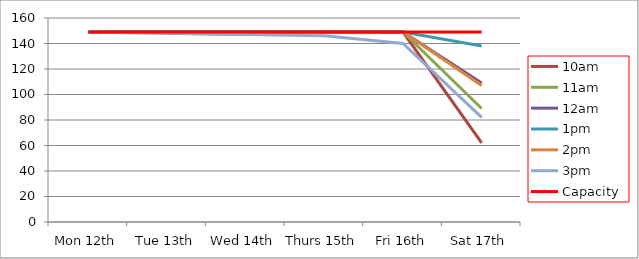
| Category | 9am | 10am | 11am | 12am | 1pm | 2pm | 3pm | 4pm | 5pm | Capacity |
|---|---|---|---|---|---|---|---|---|---|---|
| Mon 12th |  | 149 | 149 | 149 | 149 | 149 | 149 |  |  | 149 |
| Tue 13th |  | 149 | 149 | 149 | 149 | 148 | 148 |  |  | 149 |
| Wed 14th |  | 149 | 149 | 149 | 149 | 147 | 147 |  |  | 149 |
| Thurs 15th |  | 149 | 149 | 149 | 149 | 149 | 146 |  |  | 149 |
| Fri 16th |  | 149 | 149 | 149 | 149 | 149 | 140 |  |  | 149 |
| Sat 17th |  | 62 | 89 | 109 | 138 | 107 | 82 |  |  | 149 |